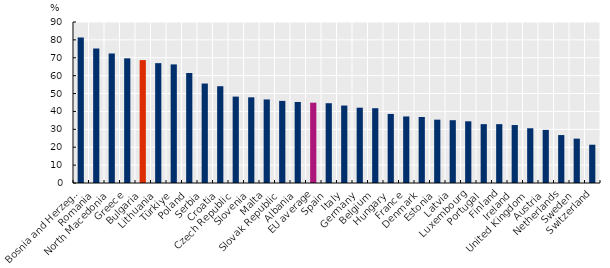
| Category | Series 0 |
|---|---|
| Bosnia and Herzegovina | 81.3 |
| Romania | 75.2 |
| North Macedonia | 72.4 |
| Greece | 69.7 |
| Bulgaria | 68.7 |
| Lithuania | 67 |
| Türkiye | 66.3 |
| Poland | 61.5 |
| Serbia | 55.6 |
| Croatia | 54.1 |
| Czech Republic | 48.3 |
| Slovenia | 47.9 |
| Malta | 46.7 |
| Slovak Republic | 45.9 |
| Albania | 45.3 |
| EU average | 44.9 |
| Spain | 44.6 |
| Italy | 43.3 |
| Germany  | 42.1 |
| Belgium | 41.8 |
| Hungary | 38.6 |
| France | 37.2 |
| Denmark | 36.9 |
| Estonia | 35.4 |
| Latvia | 35.1 |
| Luxembourg | 34.5 |
| Portugal | 32.9 |
| Finland | 32.9 |
| Ireland | 32.4 |
| United Kingdom | 30.6 |
| Austria | 29.7 |
| Netherlands | 26.8 |
| Sweden | 24.8 |
| Switzerland | 21.4 |